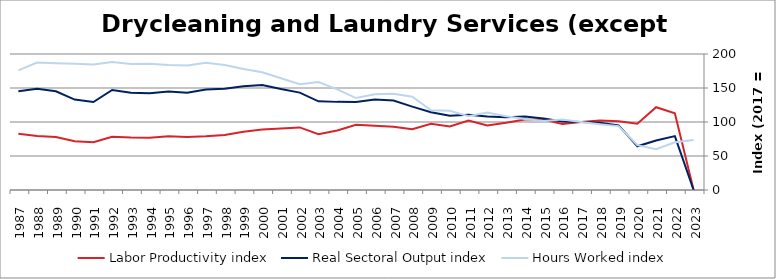
| Category | Labor Productivity index | Real Sectoral Output index | Hours Worked index |
|---|---|---|---|
| 2023.0 | 0 | 0 | 73.46 |
| 2022.0 | 112.875 | 79.271 | 70.229 |
| 2021.0 | 121.741 | 72.88 | 59.864 |
| 2020.0 | 97.404 | 64.309 | 66.023 |
| 2019.0 | 101.149 | 95.057 | 93.977 |
| 2018.0 | 102.084 | 98.827 | 96.809 |
| 2017.0 | 100 | 100 | 100 |
| 2016.0 | 97.233 | 100.641 | 103.505 |
| 2015.0 | 103.536 | 104.982 | 101.396 |
| 2014.0 | 103.57 | 108.063 | 104.338 |
| 2013.0 | 98.753 | 107.157 | 108.51 |
| 2012.0 | 94.842 | 107.971 | 113.843 |
| 2011.0 | 102.087 | 110.829 | 108.564 |
| 2010.0 | 93.557 | 109.068 | 116.579 |
| 2009.0 | 97.467 | 114.279 | 117.249 |
| 2008.0 | 89.316 | 122.619 | 137.286 |
| 2007.0 | 92.85 | 131.559 | 141.69 |
| 2006.0 | 94.577 | 133.039 | 140.667 |
| 2005.0 | 95.86 | 129.588 | 135.185 |
| 2004.0 | 87.536 | 129.596 | 148.049 |
| 2003.0 | 82.194 | 130.467 | 158.73 |
| 2002.0 | 92.036 | 143.254 | 155.65 |
| 2001.0 | 90.283 | 148.396 | 164.368 |
| 2000.0 | 89.125 | 154.308 | 173.137 |
| 1999.0 | 85.687 | 152.468 | 177.936 |
| 1998.0 | 80.927 | 148.741 | 183.797 |
| 1997.0 | 78.979 | 147.721 | 187.039 |
| 1996.0 | 78.107 | 143.1 | 183.21 |
| 1995.0 | 78.932 | 144.994 | 183.694 |
| 1994.0 | 76.668 | 142.334 | 185.649 |
| 1993.0 | 77.096 | 142.924 | 185.384 |
| 1992.0 | 78.183 | 147.119 | 188.172 |
| 1991.0 | 70.137 | 129.435 | 184.545 |
| 1990.0 | 71.594 | 132.931 | 185.674 |
| 1989.0 | 77.84 | 145.212 | 186.553 |
| 1988.0 | 79.337 | 148.791 | 187.545 |
| 1987.0 | 82.661 | 145.353 | 175.842 |